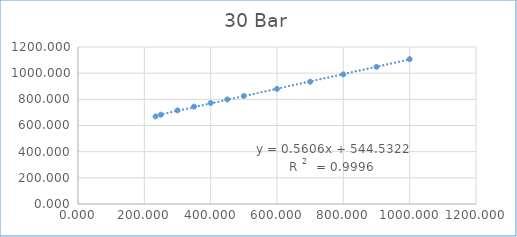
| Category | Series 0 |
|---|---|
| 233.9 | 669.661 |
| 250.0 | 682.394 |
| 300.0 | 715.313 |
| 350.0 | 744.41 |
| 400.0 | 772.026 |
| 450.0 | 799.044 |
| 500.0 | 825.896 |
| 600.0 | 879.79 |
| 700.0 | 934.591 |
| 800.0 | 990.659 |
| 900.0 | 1048.137 |
| 1000.0 | 1107.047 |